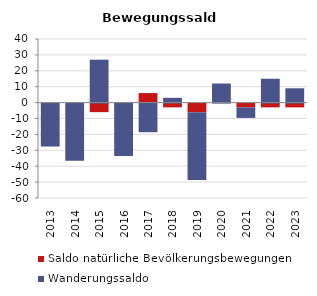
| Category | Saldo natürliche Bevölkerungsbewegungen | Wanderungssaldo |
|---|---|---|
| 2013.0 | 0 | -27 |
| 2014.0 | 0 | -36 |
| 2015.0 | -6 | 27 |
| 2016.0 | 0 | -33 |
| 2017.0 | 6 | -18 |
| 2018.0 | -3 | 3 |
| 2019.0 | -6 | -42 |
| 2020.0 | 0 | 12 |
| 2021.0 | -3 | -6 |
| 2022.0 | -3 | 15 |
| 2023.0 | -3 | 9 |